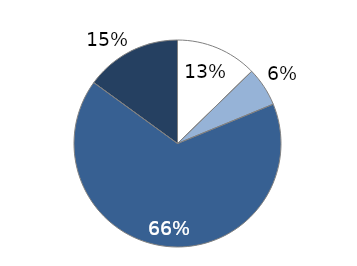
| Category | Electricity |
|---|---|
| EUR 0   | 0.127 |
| EUR 0-5   | 0.061 |
| EUR 5-30   | 0.662 |
| EUR >30 per tonne of CO2 | 0.15 |